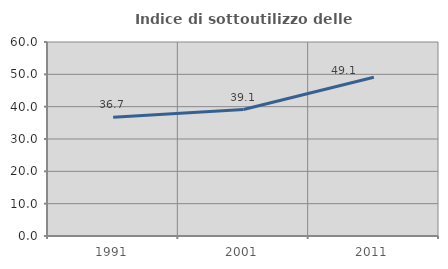
| Category | Indice di sottoutilizzo delle abitazioni  |
|---|---|
| 1991.0 | 36.702 |
| 2001.0 | 39.106 |
| 2011.0 | 49.08 |